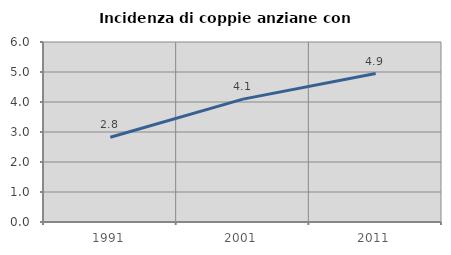
| Category | Incidenza di coppie anziane con figli |
|---|---|
| 1991.0 | 2.823 |
| 2001.0 | 4.096 |
| 2011.0 | 4.949 |